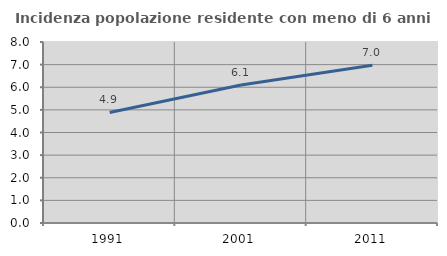
| Category | Incidenza popolazione residente con meno di 6 anni |
|---|---|
| 1991.0 | 4.887 |
| 2001.0 | 6.096 |
| 2011.0 | 6.975 |